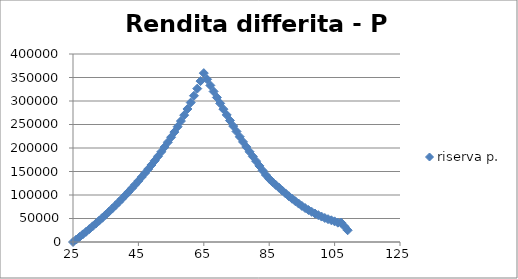
| Category | riserva p. |
|---|---|
| 25.0 | 0 |
| 26.0 | 5276.318 |
| 27.0 | 10662.929 |
| 28.0 | 16162.255 |
| 29.0 | 21776.443 |
| 30.0 | 27507.226 |
| 31.0 | 33358.395 |
| 32.0 | 39331.914 |
| 33.0 | 45431.744 |
| 34.0 | 51661.45 |
| 35.0 | 58026.072 |
| 36.0 | 64526.092 |
| 37.0 | 71166.843 |
| 38.0 | 77951.214 |
| 39.0 | 84885.458 |
| 40.0 | 91974.76 |
| 41.0 | 99225.709 |
| 42.0 | 106641.151 |
| 43.0 | 114230.667 |
| 44.0 | 122000.041 |
| 45.0 | 129963.368 |
| 46.0 | 138126.688 |
| 47.0 | 146496.053 |
| 48.0 | 155096.989 |
| 49.0 | 163928.07 |
| 50.0 | 173006.011 |
| 51.0 | 182349.431 |
| 52.0 | 191985.137 |
| 53.0 | 201928.403 |
| 54.0 | 212245.358 |
| 55.0 | 222886.112 |
| 56.0 | 233904.267 |
| 57.0 | 245356.501 |
| 58.0 | 257330.583 |
| 59.0 | 269827.669 |
| 60.0 | 282980.114 |
| 61.0 | 296737.582 |
| 62.0 | 311173.923 |
| 63.0 | 326358.906 |
| 64.0 | 342331.879 |
| 65.0 | 359286.049 |
| 66.0 | 346155.559 |
| 67.0 | 333153.68 |
| 68.0 | 320289.824 |
| 69.0 | 307508.172 |
| 70.0 | 294914.029 |
| 71.0 | 282555.156 |
| 72.0 | 270368.959 |
| 73.0 | 258422.19 |
| 74.0 | 246640.782 |
| 75.0 | 235108.422 |
| 76.0 | 223867.077 |
| 77.0 | 212928.248 |
| 78.0 | 202243.645 |
| 79.0 | 191915.472 |
| 80.0 | 181897.768 |
| 81.0 | 172027.754 |
| 82.0 | 161977.178 |
| 83.0 | 151962.808 |
| 84.0 | 142530.261 |
| 85.0 | 134522.975 |
| 86.0 | 127614.019 |
| 87.0 | 121376.637 |
| 88.0 | 115506.208 |
| 89.0 | 109308.726 |
| 90.0 | 103266.19 |
| 91.0 | 97432.321 |
| 92.0 | 92026.084 |
| 93.0 | 86790.488 |
| 94.0 | 81695.121 |
| 95.0 | 76787.623 |
| 96.0 | 72171.568 |
| 97.0 | 68003.384 |
| 98.0 | 64136.475 |
| 99.0 | 60544.127 |
| 100.0 | 57244.752 |
| 101.0 | 54062.88 |
| 102.0 | 51097.132 |
| 103.0 | 48553.193 |
| 104.0 | 46200.493 |
| 105.0 | 43924.771 |
| 106.0 | 41180.303 |
| 107.0 | 41259.772 |
| 108.0 | 33169.935 |
| 109.0 | 25000 |